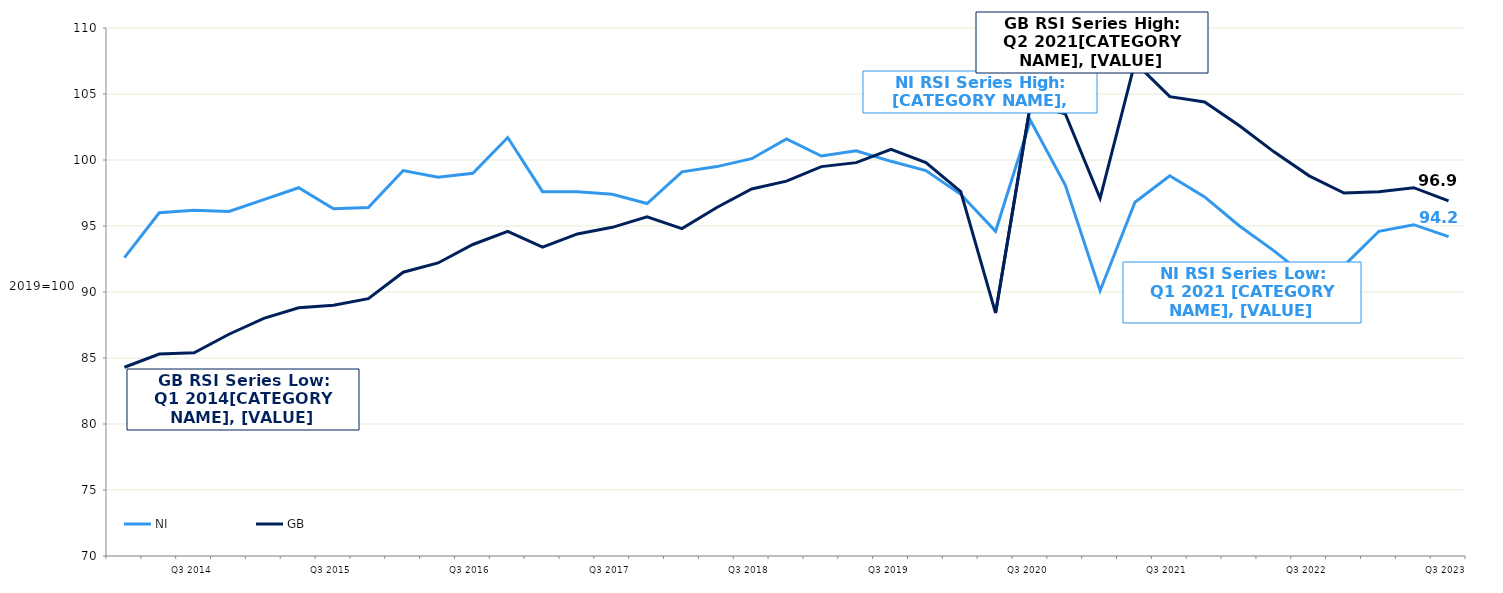
| Category | NI | GB  |
|---|---|---|
|  | 92.6 | 84.3 |
|  | 96 | 85.3 |
| Q3 2014 | 96.2 | 85.4 |
|  | 96.1 | 86.8 |
|  | 97 | 88 |
|  | 97.9 | 88.8 |
| Q3 2015 | 96.3 | 89 |
|  | 96.4 | 89.5 |
|  | 99.2 | 91.5 |
|  | 98.7 | 92.2 |
| Q3 2016 | 99 | 93.6 |
|  | 101.7 | 94.6 |
|  | 97.6 | 93.4 |
|  | 97.6 | 94.4 |
| Q3 2017 | 97.4 | 94.9 |
|  | 96.7 | 95.7 |
|  | 99.1 | 94.8 |
|  | 99.5 | 96.4 |
| Q3 2018 | 100.1 | 97.8 |
|  | 101.6 | 98.4 |
|  | 100.3 | 99.5 |
|  | 100.7 | 99.8 |
| Q3 2019 | 99.9 | 100.8 |
|  | 99.2 | 99.8 |
|  | 97.4 | 97.6 |
|  | 94.6 | 88.4 |
| Q3 2020 | 103 | 104.2 |
|  | 98.1 | 103.5 |
|  | 90.1 | 97.1 |
|  | 96.8 | 107.4 |
| Q3 2021 | 98.8 | 104.8 |
|  | 97.2 | 104.4 |
|  | 95 | 102.6 |
|  | 93.1 | 100.6 |
| Q3 2022 | 91 | 98.8 |
|  | 92 | 97.5 |
|  | 94.6 | 97.6 |
|  | 95.1 | 97.9 |
| Q3 2023 | 94.2 | 96.9 |